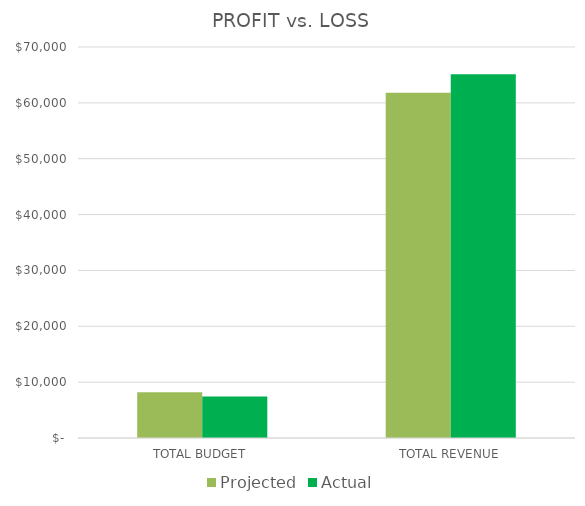
| Category | Projected | Actual |
|---|---|---|
| TOTAL BUDGET | 8180 | 7430 |
| TOTAL REVENUE | 61800 | 65125 |